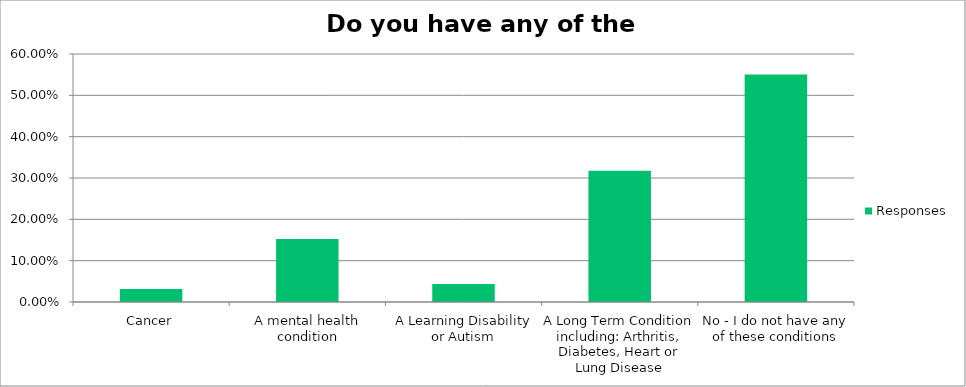
| Category | Responses |
|---|---|
| Cancer | 0.032 |
| A mental health condition | 0.153 |
| A Learning Disability or Autism | 0.044 |
| A Long Term Condition including: Arthritis, Diabetes, Heart or Lung Disease | 0.317 |
| No - I do not have any of these conditions | 0.55 |